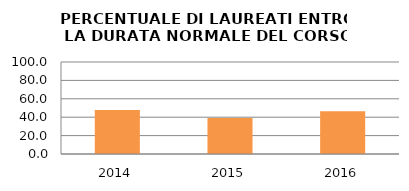
| Category | 2014 2015 2016 |
|---|---|
| 2014.0 | 47.826 |
| 2015.0 | 39.13 |
| 2016.0 | 46.429 |